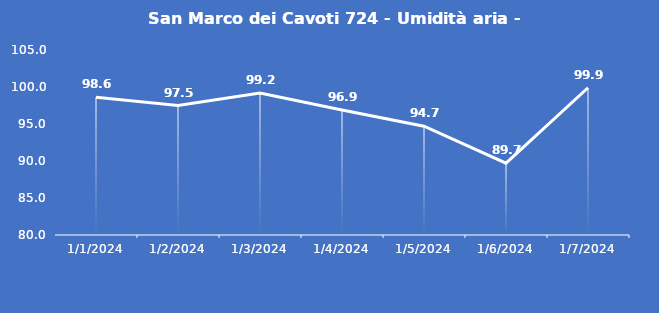
| Category | San Marco dei Cavoti 724 - Umidità aria - Grezzo (%) |
|---|---|
| 1/1/24 | 98.6 |
| 1/2/24 | 97.5 |
| 1/3/24 | 99.2 |
| 1/4/24 | 96.9 |
| 1/5/24 | 94.7 |
| 1/6/24 | 89.7 |
| 1/7/24 | 99.9 |